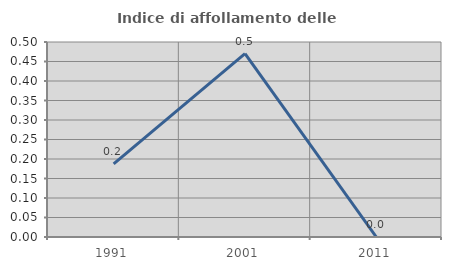
| Category | Indice di affollamento delle abitazioni  |
|---|---|
| 1991.0 | 0.187 |
| 2001.0 | 0.47 |
| 2011.0 | 0 |